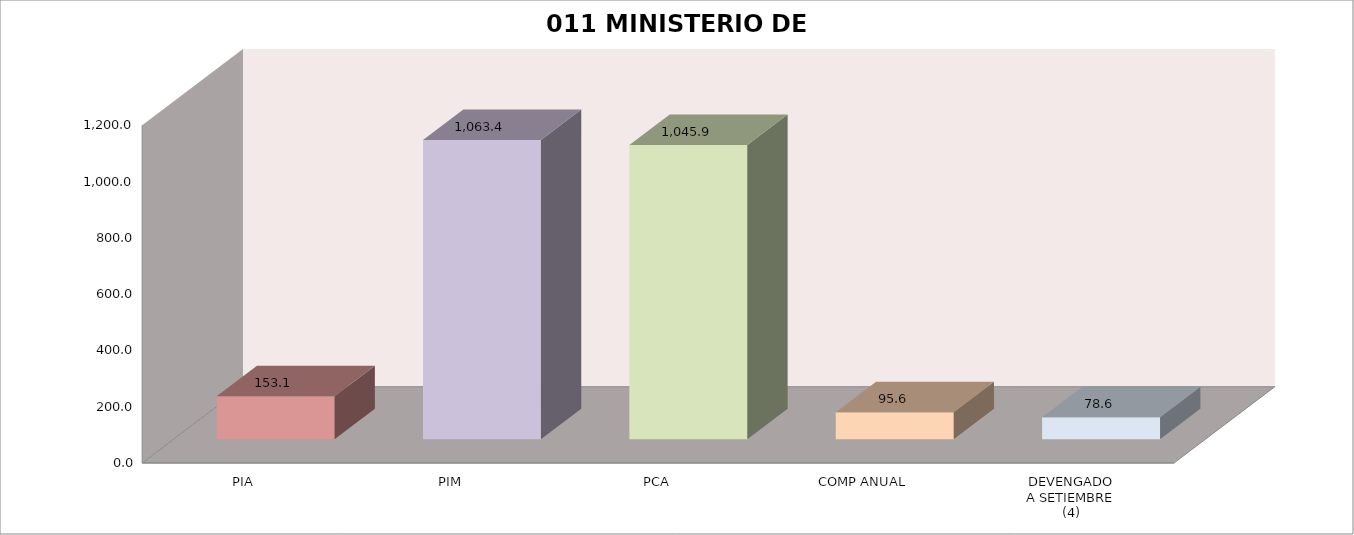
| Category | 011 MINISTERIO DE SALUD |
|---|---|
| PIA | 153.071 |
| PIM | 1063.378 |
| PCA | 1045.854 |
| COMP ANUAL | 95.576 |
| DEVENGADO
A SETIEMBRE
(4) | 78.577 |